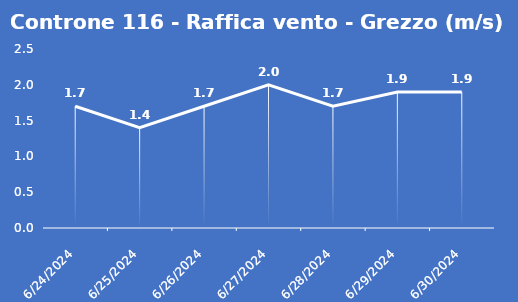
| Category | Controne 116 - Raffica vento - Grezzo (m/s) |
|---|---|
| 6/24/24 | 1.7 |
| 6/25/24 | 1.4 |
| 6/26/24 | 1.7 |
| 6/27/24 | 2 |
| 6/28/24 | 1.7 |
| 6/29/24 | 1.9 |
| 6/30/24 | 1.9 |